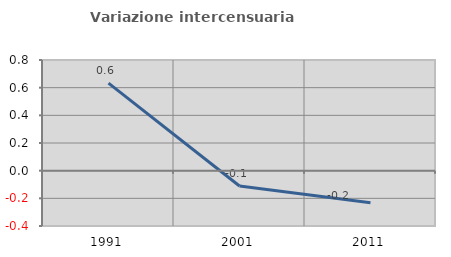
| Category | Variazione intercensuaria annua |
|---|---|
| 1991.0 | 0.633 |
| 2001.0 | -0.111 |
| 2011.0 | -0.231 |